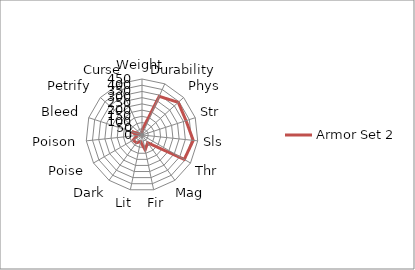
| Category | Armor Set 2 |
|---|---|
| Weight | 37.2 |
| Durability | 340 |
| Phys | 392 |
| Str | 372 |
| Sls | 414 |
| Thr | 392 |
| Mag | 77 |
| Fir | 122 |
| Lit | 55 |
| Dark | 77 |
| Poise | 82 |
| Poison | 40 |
| Bleed | 87 |
| Petrify | 0 |
| Curse | 0 |